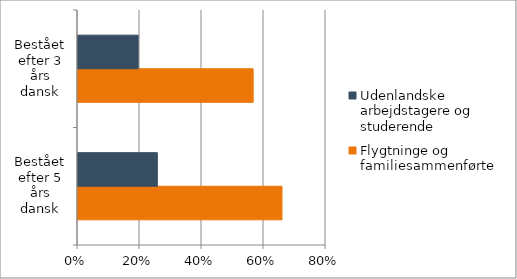
| Category | Flygtninge og familiesammenførte  | Udenlandske arbejdstagere og studerende  |
|---|---|---|
| Bestået efter 5 års dansk | 0.658 | 0.256 |
| Bestået efter 3 års dansk | 0.565 | 0.194 |